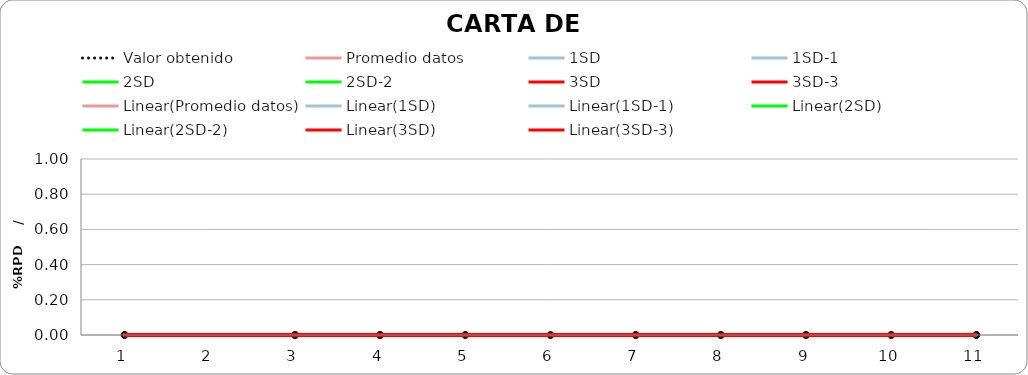
| Category | Valor obtenido | Promedio datos | 1SD | 1SD-1 | 2SD | 2SD-2 | 3SD | 3SD-3 |
|---|---|---|---|---|---|---|---|---|
| 1.0 | 0 | 0 | 0 | 0 | 0 | 0 | 0 | 0 |
| 2.0 | 0 | 0 | 0 | 0 | 0 | 0 | 0 | 0 |
| 3.0 | 0 | 0 | 0 | 0 | 0 | 0 | 0 | 0 |
| 4.0 | 0 | 0 | 0 | 0 | 0 | 0 | 0 | 0 |
| 5.0 | 0 | 0 | 0 | 0 | 0 | 0 | 0 | 0 |
| 6.0 | 0 | 0 | 0 | 0 | 0 | 0 | 0 | 0 |
| 7.0 | 0 | 0 | 0 | 0 | 0 | 0 | 0 | 0 |
| 8.0 | 0 | 0 | 0 | 0 | 0 | 0 | 0 | 0 |
| 9.0 | 0 | 0 | 0 | 0 | 0 | 0 | 0 | 0 |
| 10.0 | 0 | 0 | 0 | 0 | 0 | 0 | 0 | 0 |
| 11.0 | 0 | 0 | 0 | 0 | 0 | 0 | 0 | 0 |